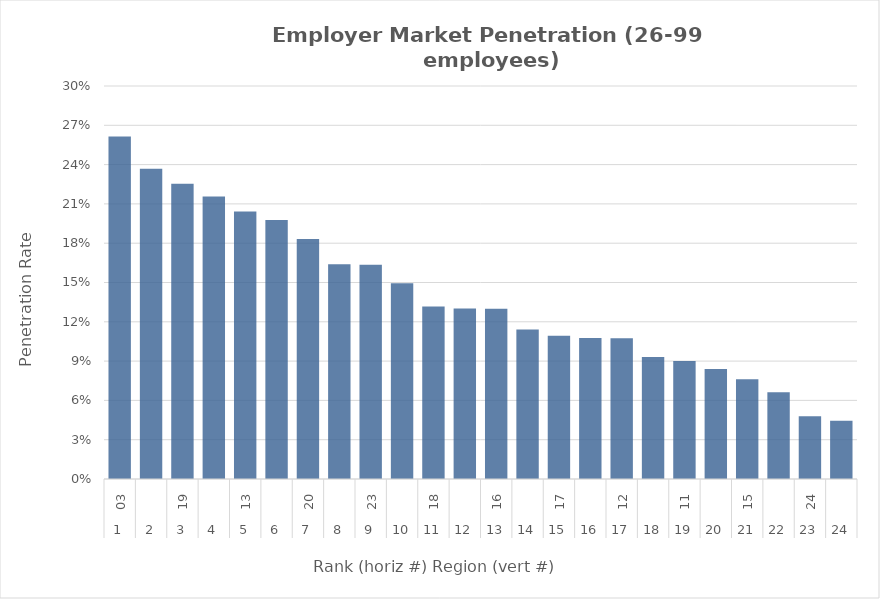
| Category | Rate |
|---|---|
| 0 | 0.262 |
| 1 | 0.237 |
| 2 | 0.225 |
| 3 | 0.216 |
| 4 | 0.204 |
| 5 | 0.198 |
| 6 | 0.183 |
| 7 | 0.164 |
| 8 | 0.164 |
| 9 | 0.149 |
| 10 | 0.132 |
| 11 | 0.13 |
| 12 | 0.13 |
| 13 | 0.114 |
| 14 | 0.109 |
| 15 | 0.108 |
| 16 | 0.107 |
| 17 | 0.093 |
| 18 | 0.09 |
| 19 | 0.084 |
| 20 | 0.076 |
| 21 | 0.066 |
| 22 | 0.048 |
| 23 | 0.044 |